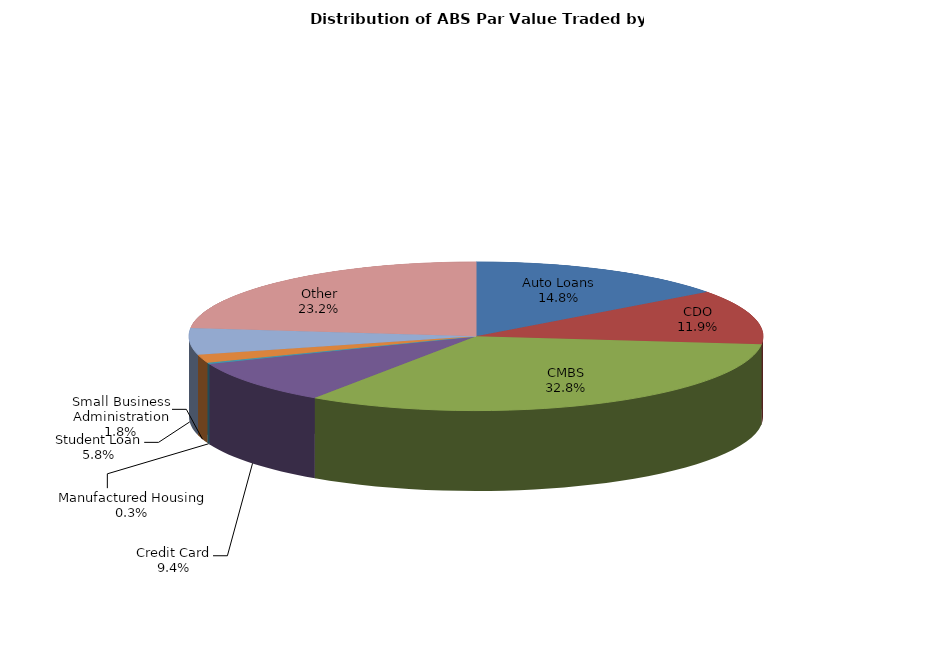
| Category | Series 0 |
|---|---|
| Auto Loans | 777947255.003 |
| CDO | 621710557.25 |
| CMBS | 1717324438.571 |
| Credit Card | 494553479.687 |
| Manufactured Housing | 15801293.948 |
| Small Business Administration | 91944909.571 |
| Student Loan | 304400550.595 |
| Other | 1216305220.944 |